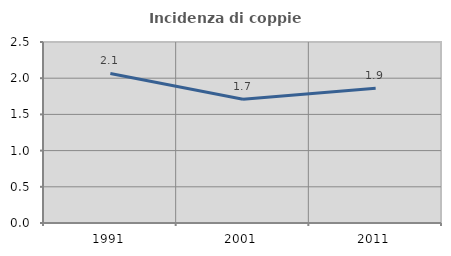
| Category | Incidenza di coppie miste |
|---|---|
| 1991.0 | 2.066 |
| 2001.0 | 1.709 |
| 2011.0 | 1.86 |